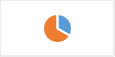
| Category | Section 1.C : Politique qualité |
|---|---|
| 0 | 0.333 |
| 1 | 0.667 |